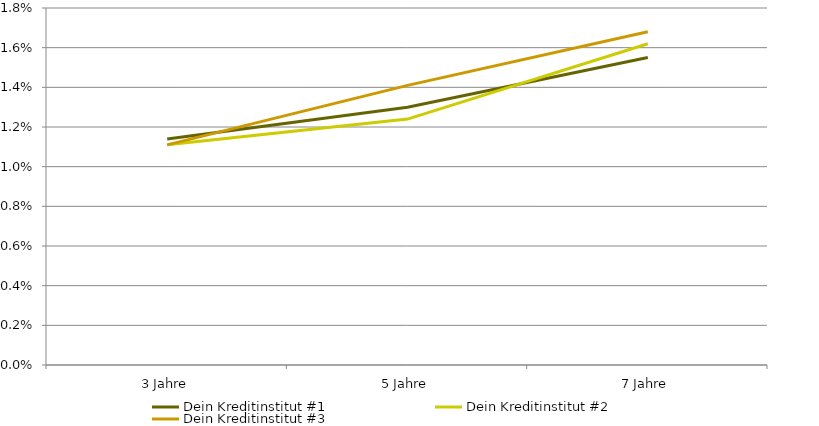
| Category | Dein Kreditinstitut #1 | Dein Kreditinstitut #2 | Dein Kreditinstitut #3 |
|---|---|---|---|
| 3 Jahre | 0.011 | 0.011 | 0.011 |
| 5 Jahre | 0.013 | 0.012 | 0.014 |
| 7 Jahre | 0.016 | 0.016 | 0.017 |